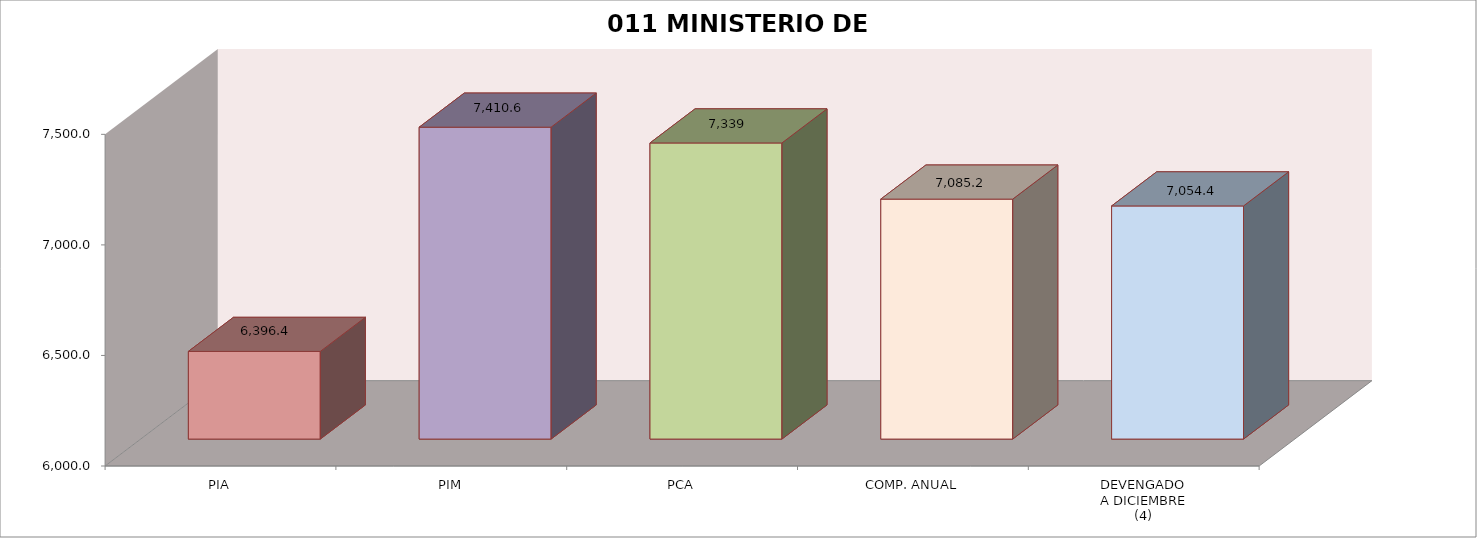
| Category | 011 MINISTERIO DE SALUD |
|---|---|
| PIA | 6396.414 |
| PIM | 7410.607 |
| PCA | 7339.239 |
| COMP. ANUAL | 7085.203 |
| DEVENGADO
A DICIEMBRE
(4) | 7054.38 |